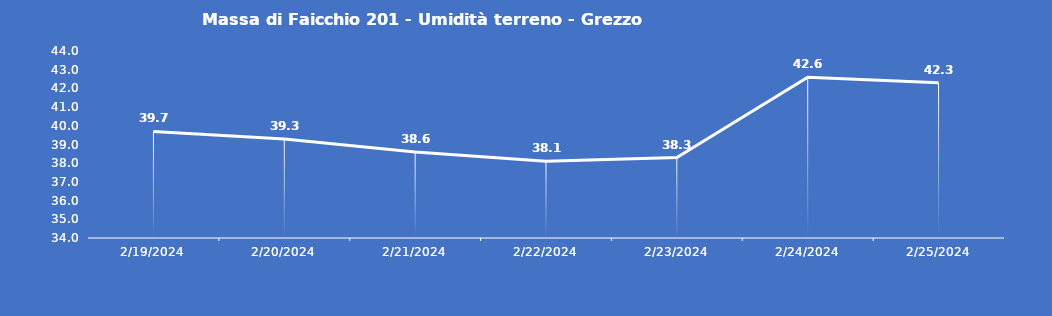
| Category | Massa di Faicchio 201 - Umidità terreno - Grezzo (%VWC) |
|---|---|
| 2/19/24 | 39.7 |
| 2/20/24 | 39.3 |
| 2/21/24 | 38.6 |
| 2/22/24 | 38.1 |
| 2/23/24 | 38.3 |
| 2/24/24 | 42.6 |
| 2/25/24 | 42.3 |